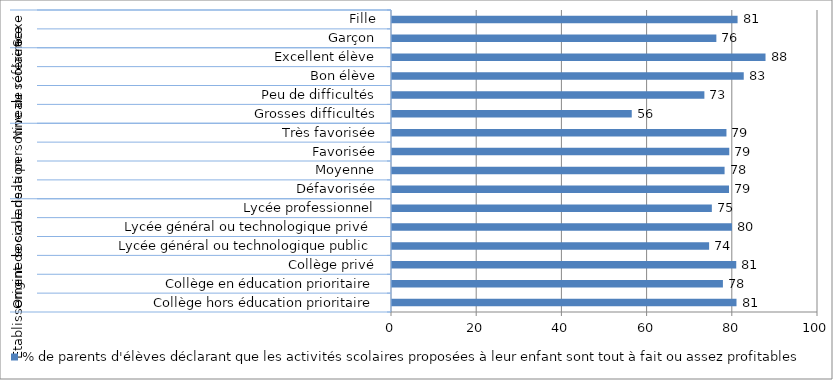
| Category | % de parents d'élèves déclarant que les activités scolaires proposées à leur enfant sont tout à fait ou assez profitables |
|---|---|
| 0 | 80.87 |
| 1 | 77.68 |
| 2 | 80.81 |
| 3 | 74.44 |
| 4 | 79.81 |
| 5 | 75.08 |
| 6 | 79.11 |
| 7 | 78.07 |
| 8 | 79.17 |
| 9 | 78.51 |
| 10 | 56.28 |
| 11 | 73.33 |
| 12 | 82.57 |
| 13 | 87.68 |
| 14 | 76.14 |
| 15 | 81.12 |